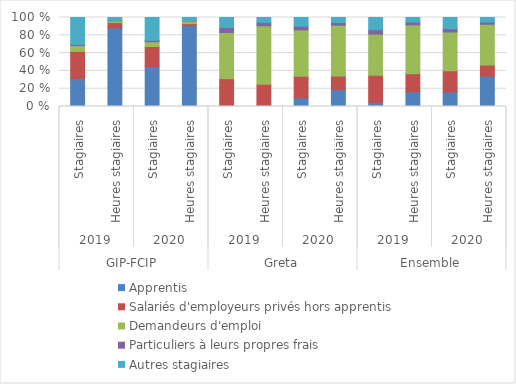
| Category | Apprentis | Salariés d'employeurs privés hors apprentis | Demandeurs d'emploi | Particuliers à leurs propres frais | Autres stagiaires |
|---|---|---|---|---|---|
| 0 | 31.6 | 30.3 | 6.6 | 1.2 | 30.3 |
| 1 | 88.4 | 5.9 | 2 | 0.4 | 3.3 |
| 2 | 45 | 22.4 | 5.4 | 1.6 | 25.6 |
| 3 | 91.1 | 2 | 3 | 0.3 | 3.6 |
| 4 | 0.9 | 30.4 | 51.9 | 5.5 | 11.3 |
| 5 | 1.5 | 23.5 | 65.7 | 3.8 | 5.5 |
| 6 | 9.8 | 24.2 | 52 | 4.2 | 9.8 |
| 7 | 19 | 15.2 | 57.1 | 3 | 5.7 |
| 8 | 4.7 | 30.4 | 46.2 | 5 | 13.7 |
| 9 | 16.4 | 20.5 | 54.8 | 3.2 | 5.1 |
| 10 | 16.2 | 23.9 | 43.6 | 3.7 | 12.6 |
| 11 | 34.1 | 12.5 | 45.8 | 2.4 | 5.2 |